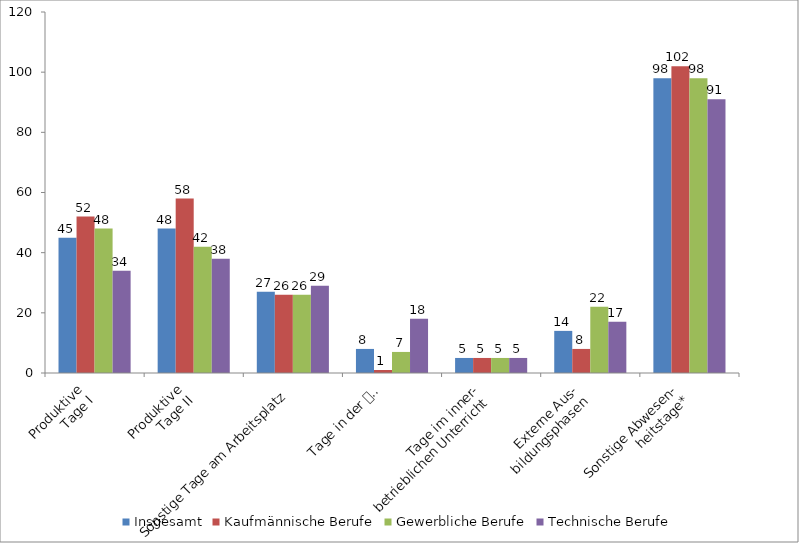
| Category | Insgesamt | Kaufmännische Berufe | Gewerbliche Berufe | Technische Berufe |
|---|---|---|---|---|
| Produktive
Tage I | 45 | 52 | 48 | 34 |
| Produktive
Tage II | 48 | 58 | 42 | 38 |
| Sonstige Tage am Arbeitsplatz | 27 | 26 | 26 | 29 |
| Tage in der 
Lehrwerkstatt | 8 | 1 | 7 | 18 |
| Tage im inner-
betrieblichen Unterricht | 5 | 5 | 5 | 5 |
| Externe Aus-
bildungsphasen | 14 | 8 | 22 | 17 |
| Sonstige Abwesen-
heitstage* | 98 | 102 | 98 | 91 |